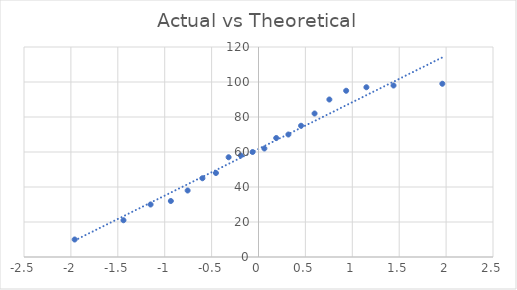
| Category | Data |
|---|---|
| -1.9599639845400538 | 10 |
| -1.4395314709384572 | 21 |
| -0.9345892910734794 | 32 |
| -0.7554150263604691 | 38 |
| -1.1503493803760083 | 30 |
| -0.5977601260424784 | 45 |
| -0.4537621901698795 | 48 |
| -0.3186393639643752 | 57 |
| -0.18911842627279254 | 58 |
| -0.06270677794321385 | 60 |
| 0.06270677794321385 | 62 |
| 0.18911842627279243 | 68 |
| 0.3186393639643752 | 70 |
| 0.4537621901698797 | 75 |
| 0.5977601260424784 | 82 |
| 0.7554150263604691 | 90 |
| 0.9345892910734801 | 95 |
| 1.1503493803760083 | 97 |
| 1.4395314709384563 | 98 |
| 1.9599639845400536 | 99 |